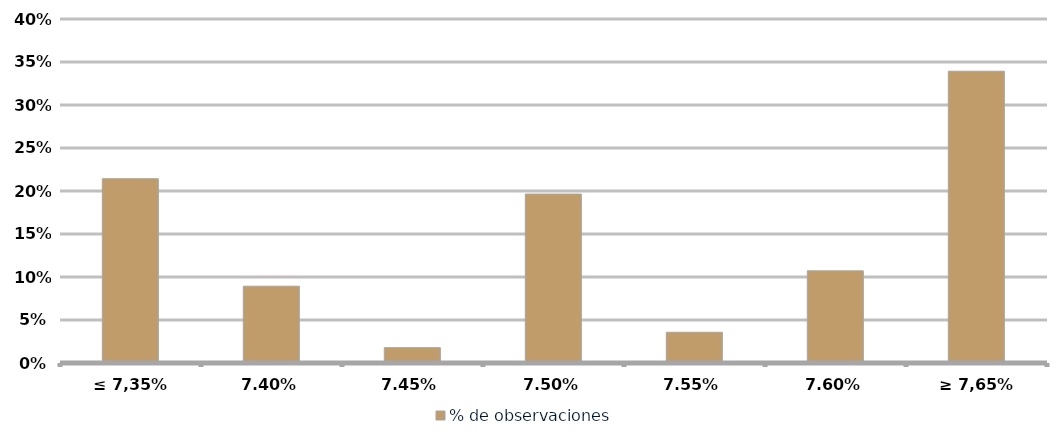
| Category | % de observaciones  |
|---|---|
| ≤ 7,35% | 0.214 |
| 7,40% | 0.089 |
| 7,45% | 0.018 |
| 7,50% | 0.196 |
| 7,55% | 0.036 |
| 7,60% | 0.107 |
| ≥ 7,65% | 0.339 |